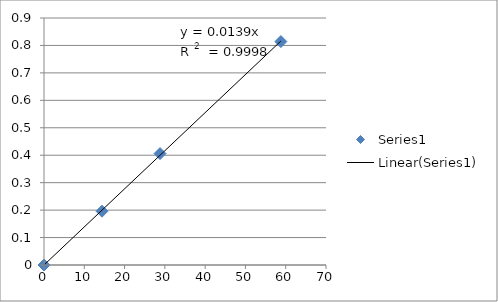
| Category | Series 0 |
|---|---|
| 0.0 | 0 |
| 14.4 | 0.196 |
| 28.8 | 0.406 |
| 58.8 | 0.814 |